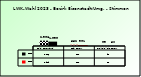
| Category | 2018 | 2023 |
|---|---|---|
| Bgld. Bauernbund | 2386 | 1939 |
| SPÖ Bauern | 552 | 381 |
| Freiheitliche Bauern | 93 | 50 |